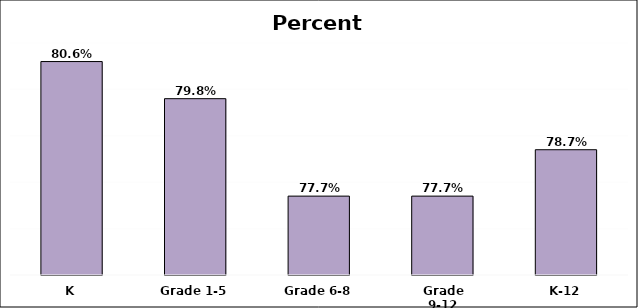
| Category | District* |
|---|---|
| K | 0.806 |
| Grade 1-5 | 0.798 |
| Grade 6-8 | 0.777 |
| Grade 9-12 | 0.777 |
| K-12 | 0.787 |